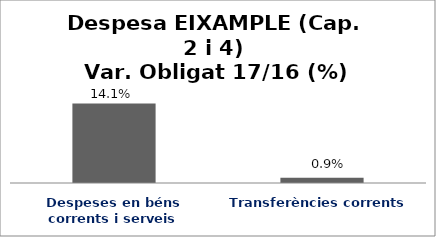
| Category | Series 0 |
|---|---|
| Despeses en béns corrents i serveis | 0.141 |
| Transferències corrents | 0.009 |